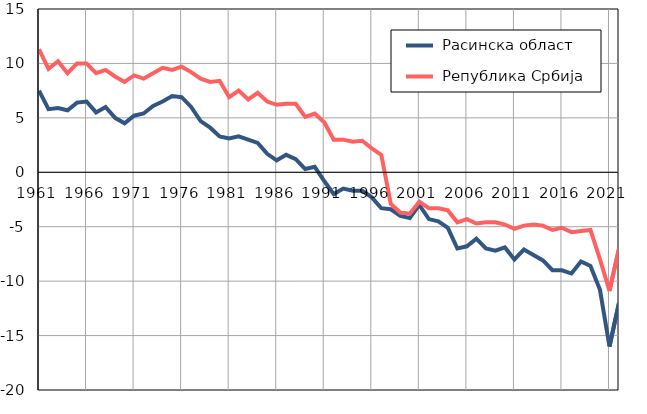
| Category |  Расинска област |  Република Србија |
|---|---|---|
| 1961.0 | 7.5 | 11.3 |
| 1962.0 | 5.8 | 9.5 |
| 1963.0 | 5.9 | 10.2 |
| 1964.0 | 5.7 | 9.1 |
| 1965.0 | 6.4 | 10 |
| 1966.0 | 6.5 | 10 |
| 1967.0 | 5.5 | 9.1 |
| 1968.0 | 6 | 9.4 |
| 1969.0 | 5 | 8.8 |
| 1970.0 | 4.5 | 8.3 |
| 1971.0 | 5.2 | 8.9 |
| 1972.0 | 5.4 | 8.6 |
| 1973.0 | 6.1 | 9.1 |
| 1974.0 | 6.5 | 9.6 |
| 1975.0 | 7 | 9.4 |
| 1976.0 | 6.9 | 9.7 |
| 1977.0 | 6 | 9.2 |
| 1978.0 | 4.7 | 8.6 |
| 1979.0 | 4.1 | 8.3 |
| 1980.0 | 3.3 | 8.4 |
| 1981.0 | 3.1 | 6.9 |
| 1982.0 | 3.3 | 7.5 |
| 1983.0 | 3 | 6.7 |
| 1984.0 | 2.7 | 7.3 |
| 1985.0 | 1.7 | 6.5 |
| 1986.0 | 1.1 | 6.2 |
| 1987.0 | 1.6 | 6.3 |
| 1988.0 | 1.2 | 6.3 |
| 1989.0 | 0.3 | 5.1 |
| 1990.0 | 0.5 | 5.4 |
| 1991.0 | -0.8 | 4.6 |
| 1992.0 | -2 | 3 |
| 1993.0 | -1.5 | 3 |
| 1994.0 | -1.7 | 2.8 |
| 1995.0 | -1.7 | 2.9 |
| 1996.0 | -2.3 | 2.2 |
| 1997.0 | -3.3 | 1.6 |
| 1998.0 | -3.4 | -2.9 |
| 1999.0 | -4 | -3.7 |
| 2000.0 | -4.2 | -3.8 |
| 2001.0 | -3 | -2.7 |
| 2002.0 | -4.3 | -3.3 |
| 2003.0 | -4.5 | -3.3 |
| 2004.0 | -5.1 | -3.5 |
| 2005.0 | -7 | -4.6 |
| 2006.0 | -6.8 | -4.3 |
| 2007.0 | -6.1 | -4.7 |
| 2008.0 | -7 | -4.6 |
| 2009.0 | -7.2 | -4.6 |
| 2010.0 | -6.9 | -4.8 |
| 2011.0 | -8 | -5.2 |
| 2012.0 | -7.1 | -4.9 |
| 2013.0 | -7.6 | -4.8 |
| 2014.0 | -8.1 | -4.9 |
| 2015.0 | -9 | -5.3 |
| 2016.0 | -9 | -5.1 |
| 2017.0 | -9.3 | -5.5 |
| 2018.0 | -8.2 | -5.4 |
| 2019.0 | -8.6 | -5.3 |
| 2020.0 | -10.8 | -8 |
| 2021.0 | -16 | -10.9 |
| 2022.0 | -12 | -7 |